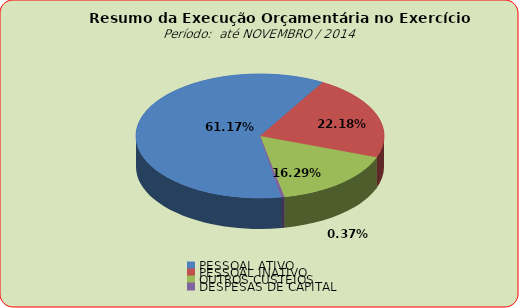
| Category | Series 0 |
|---|---|
| PESSOAL ATIVO | 107862374.86 |
| PESSOAL INATIVO | 39103289.18 |
| OUTROS CUSTEIOS | 28717538.38 |
| DESPESAS DE CAPITAL | 653565.79 |